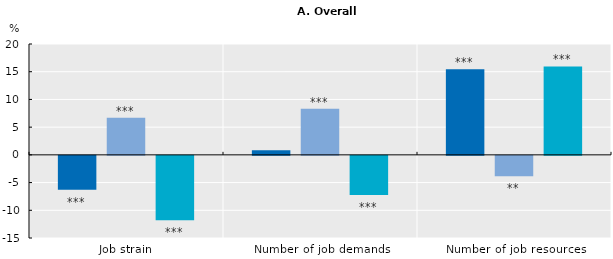
| Category | Mixed voice (dircect and representative voice) | Representative voice (union and non-union) | Direct voice |
|---|---|---|---|
| Job strain | -6.1 | 6.7 | -11.6 |
| Number of job demands | 0.852 | 8.308 | -7.083 |
| Number of job resources | 15.436 | -3.684 | 15.962 |